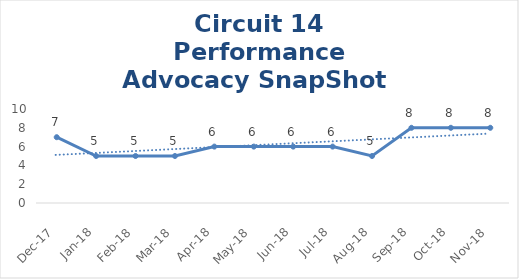
| Category | Circuit 14 |
|---|---|
| Dec-17 | 7 |
| Jan-18 | 5 |
| Feb-18 | 5 |
| Mar-18 | 5 |
| Apr-18 | 6 |
| May-18 | 6 |
| Jun-18 | 6 |
| Jul-18 | 6 |
| Aug-18 | 5 |
| Sep-18 | 8 |
| Oct-18 | 8 |
| Nov-18 | 8 |